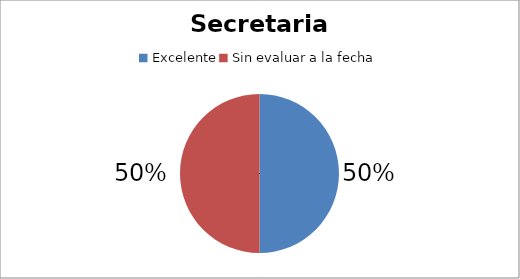
| Category | Cantidad |
|---|---|
| Excelente | 1 |
| Sin evaluar a la fecha | 1 |